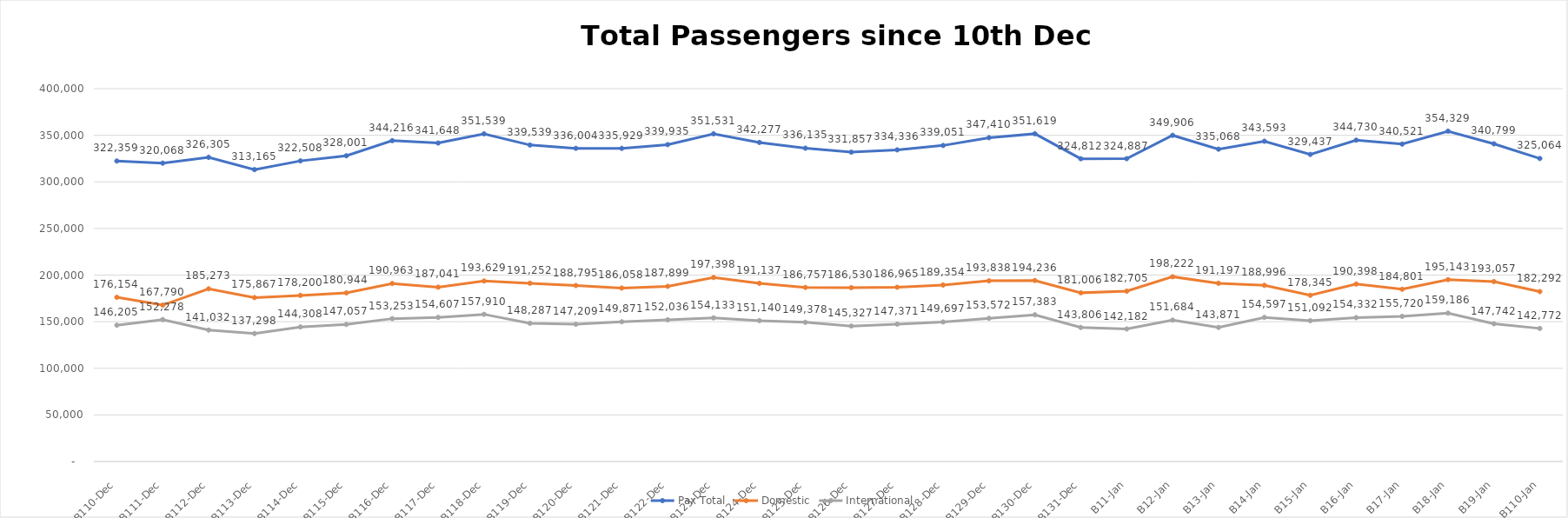
| Category | Pax Total |  Domestic  |  International  |
|---|---|---|---|
| 2022-12-10 | 322359 | 176154 | 146205 |
| 2022-12-11 | 320068 | 167790 | 152278 |
| 2022-12-12 | 326305 | 185273 | 141032 |
| 2022-12-13 | 313165 | 175867 | 137298 |
| 2022-12-14 | 322508 | 178200 | 144308 |
| 2022-12-15 | 328001 | 180944 | 147057 |
| 2022-12-16 | 344216 | 190963 | 153253 |
| 2022-12-17 | 341648 | 187041 | 154607 |
| 2022-12-18 | 351539 | 193629 | 157910 |
| 2022-12-19 | 339539 | 191252 | 148287 |
| 2022-12-20 | 336004 | 188795 | 147209 |
| 2022-12-21 | 335929 | 186058 | 149871 |
| 2022-12-22 | 339935 | 187899 | 152036 |
| 2022-12-23 | 351531 | 197398 | 154133 |
| 2022-12-24 | 342277 | 191137 | 151140 |
| 2022-12-25 | 336135 | 186757 | 149378 |
| 2022-12-26 | 331857 | 186530 | 145327 |
| 2022-12-27 | 334336 | 186965 | 147371 |
| 2022-12-28 | 339051 | 189354 | 149697 |
| 2022-12-29 | 347410 | 193838 | 153572 |
| 2022-12-30 | 351619 | 194236 | 157383 |
| 2022-12-31 | 324812 | 181006 | 143806 |
| 2023-01-01 | 324887 | 182705 | 142182 |
| 2023-01-02 | 349906 | 198222 | 151684 |
| 2023-01-03 | 335068 | 191197 | 143871 |
| 2023-01-04 | 343593 | 188996 | 154597 |
| 2023-01-05 | 329437 | 178345 | 151092 |
| 2023-01-06 | 344730 | 190398 | 154332 |
| 2023-01-07 | 340521 | 184801 | 155720 |
| 2023-01-08 | 354329 | 195143 | 159186 |
| 2023-01-09 | 340799 | 193057 | 147742 |
| 2023-01-10 | 325064 | 182292 | 142772 |